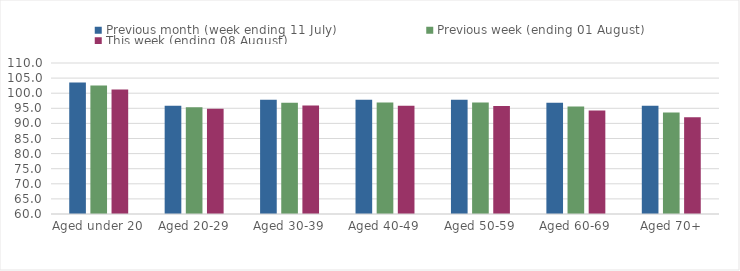
| Category | Previous month (week ending 11 July) | Previous week (ending 01 August) | This week (ending 08 August) |
|---|---|---|---|
| Aged under 20 | 103.568 | 102.559 | 101.221 |
| Aged 20-29 | 95.877 | 95.37 | 94.847 |
| Aged 30-39 | 97.819 | 96.829 | 95.945 |
| Aged 40-49 | 97.867 | 96.921 | 95.858 |
| Aged 50-59 | 97.834 | 96.885 | 95.789 |
| Aged 60-69 | 96.838 | 95.602 | 94.271 |
| Aged 70+ | 95.838 | 93.603 | 92.05 |